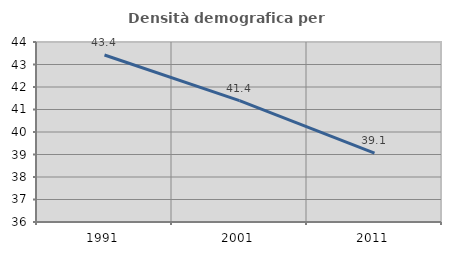
| Category | Densità demografica |
|---|---|
| 1991.0 | 43.422 |
| 2001.0 | 41.397 |
| 2011.0 | 39.057 |